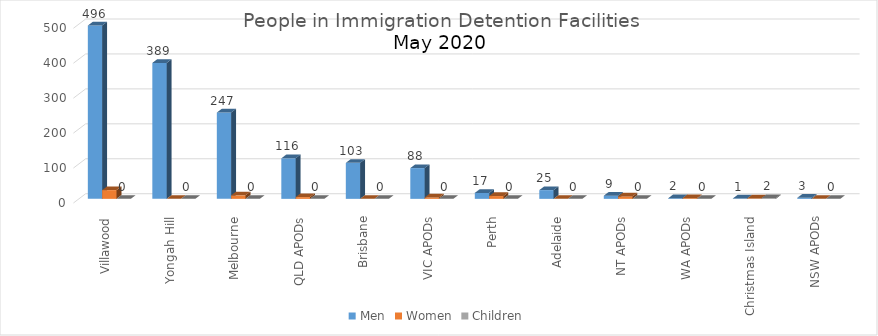
| Category | Men | Women | Children |
|---|---|---|---|
| Villawood | 496 | 25 | 0 |
| Yongah Hill | 389 | 0 | 0 |
| Melbourne | 247 | 10 | 0 |
| QLD APODs | 116 | 5 | 0 |
| Brisbane | 103 | 0 | 0 |
| VIC APODs | 88 | 4 | 0 |
| Perth | 17 | 8 | 0 |
| Adelaide | 25 | 0 | 0 |
| NT APODs | 9 | 7 | 0 |
| WA APODs | 2 | 2 | 0 |
| Christmas Island | 1 | 1 | 2 |
| NSW APODs | 3 | 0 | 0 |